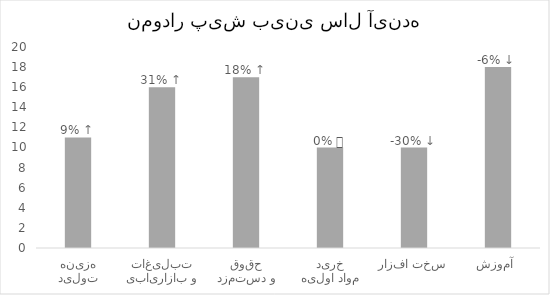
| Category | Series 0 |
|---|---|
| هزینه تولید | 11 |
| تبلیغات و بازاریابی | 16 |
| حقوق و دستمزد | 17 |
| خرید مواد اولیه | 10 |
| سخت افزار | 10 |
| آموزش  | 18 |